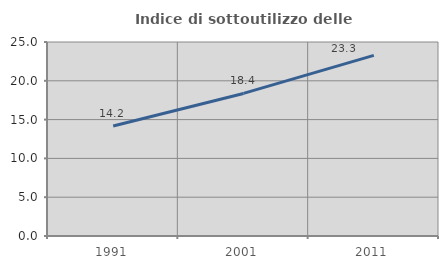
| Category | Indice di sottoutilizzo delle abitazioni  |
|---|---|
| 1991.0 | 14.167 |
| 2001.0 | 18.373 |
| 2011.0 | 23.283 |